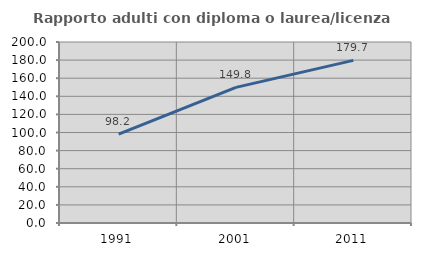
| Category | Rapporto adulti con diploma o laurea/licenza media  |
|---|---|
| 1991.0 | 98.229 |
| 2001.0 | 149.841 |
| 2011.0 | 179.721 |